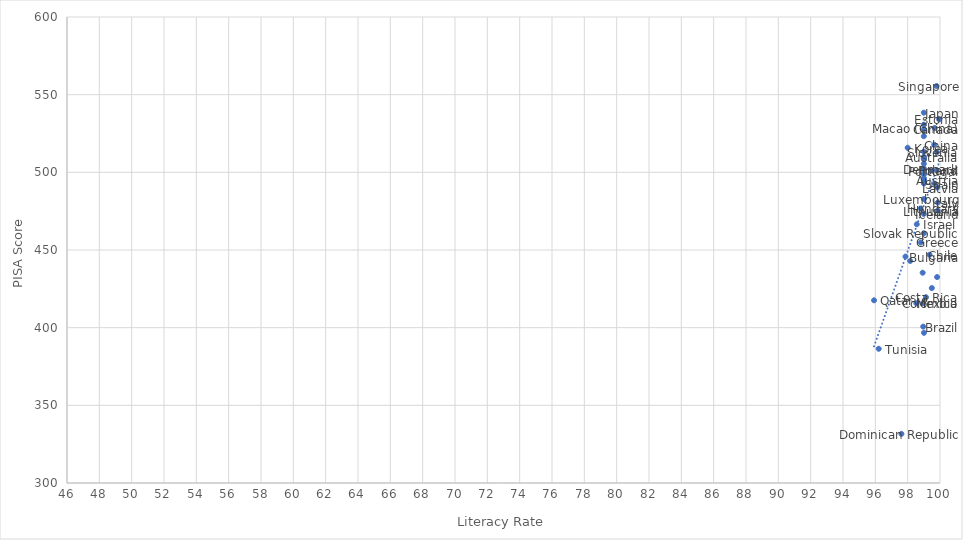
| Category | Series 0 |
|---|---|
| 99.0 | 509.994 |
| 99.0 | 495.037 |
| 98.96375 | 400.682 |
| 97.86505 | 445.772 |
| 99.0 | 527.705 |
| 99.3539399999999 | 446.956 |
| 99.64229 | 517.779 |
| 98.53473 | 415.729 |
| 99.1337 | 419.608 |
| 99.82099 | 432.577 |
| 99.0 | 492.83 |
| 99.0 | 501.937 |
| 97.61406 | 331.639 |
| 99.9489 | 534.194 |
| 99.0 | 530.661 |
| 99.0 | 494.978 |
| 99.0 | 509.141 |
| 98.81486 | 454.829 |
| 99.0 | 523.277 |
| 98.8 | 476.748 |
| 99.0 | 473.23 |
| 99.0 | 502.575 |
| 98.56286 | 466.553 |
| 99.85964 | 480.547 |
| 99.0 | 538.395 |
| 98.0 | 515.81 |
| 99.83543 | 490.225 |
| 99.8558 | 475.409 |
| 99.0 | 482.806 |
| 99.6729 | 528.55 |
| 98.15448 | 442.948 |
| 98.94471 | 415.71 |
| 99.0 | 508.575 |
| 99.0 | 513.304 |
| 99.0 | 498.481 |
| 99.00954 | 396.684 |
| 99.79683 | 501.435 |
| 99.43512 | 501.1 |
| 95.92071 | 417.611 |
| 99.7848999999999 | 555.575 |
| 99.0 | 460.775 |
| 99.8 | 512.864 |
| 99.65568 | 492.786 |
| 99.0 | 493.422 |
| 99.0 | 505.506 |
| 96.2091 | 386.403 |
| 99.49439 | 425.49 |
| 99.0 | 509.222 |
| 99.0 | 496.242 |
| 98.9276 | 435.363 |